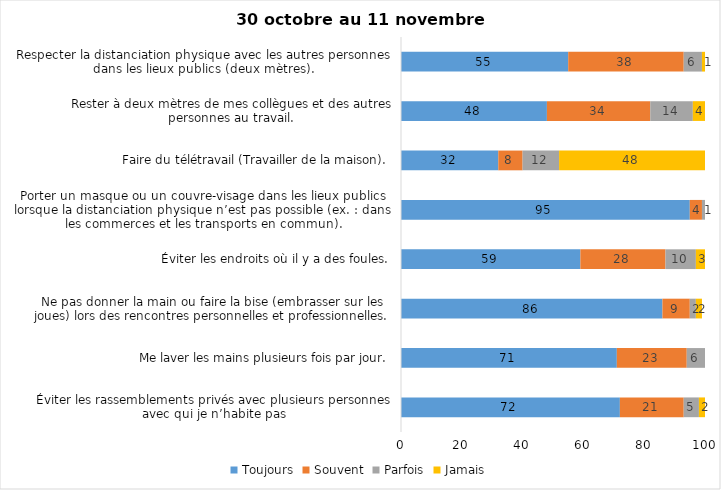
| Category | Toujours | Souvent | Parfois | Jamais |
|---|---|---|---|---|
| Éviter les rassemblements privés avec plusieurs personnes avec qui je n’habite pas | 72 | 21 | 5 | 2 |
| Me laver les mains plusieurs fois par jour. | 71 | 23 | 6 | 0 |
| Ne pas donner la main ou faire la bise (embrasser sur les joues) lors des rencontres personnelles et professionnelles. | 86 | 9 | 2 | 2 |
| Éviter les endroits où il y a des foules. | 59 | 28 | 10 | 3 |
| Porter un masque ou un couvre-visage dans les lieux publics lorsque la distanciation physique n’est pas possible (ex. : dans les commerces et les transports en commun). | 95 | 4 | 1 | 0 |
| Faire du télétravail (Travailler de la maison). | 32 | 8 | 12 | 48 |
| Rester à deux mètres de mes collègues et des autres personnes au travail. | 48 | 34 | 14 | 4 |
| Respecter la distanciation physique avec les autres personnes dans les lieux publics (deux mètres). | 55 | 38 | 6 | 1 |